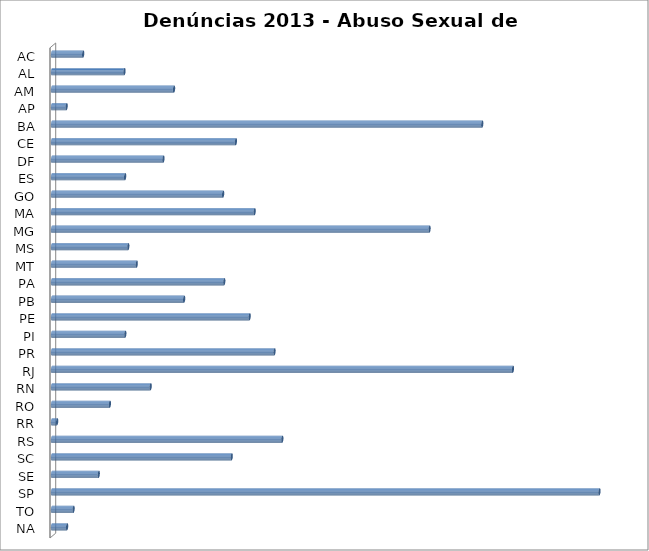
| Category | Series 0 |
|---|---|
| AC | 188 |
| AL | 437 |
| AM | 736 |
| AP | 88 |
| BA | 2595 |
| CE | 1109 |
| DF | 672 |
| ES | 441 |
| GO | 1032 |
| MA | 1222 |
| MG | 2277 |
| MS | 460 |
| MT | 511 |
| PA | 1039 |
| PB | 797 |
| PE | 1192 |
| PI | 442 |
| PR | 1342 |
| RJ | 2780 |
| RN | 595 |
| RO | 349 |
| RR | 31 |
| RS | 1389 |
| SC | 1084 |
| SE | 282 |
| SP | 3302 |
| TO | 130 |
| NA | 91 |